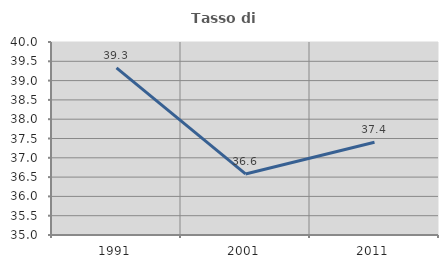
| Category | Tasso di occupazione   |
|---|---|
| 1991.0 | 39.329 |
| 2001.0 | 36.582 |
| 2011.0 | 37.405 |